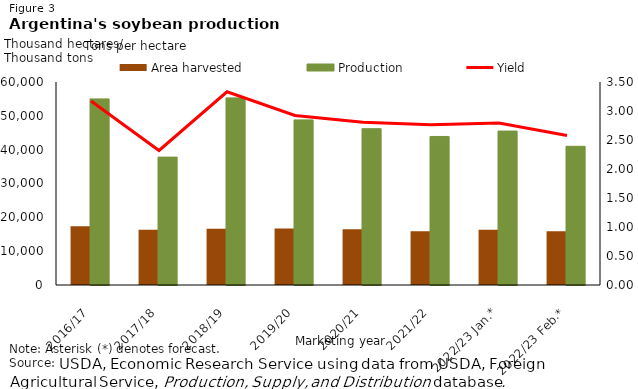
| Category | Area harvested | Production |
|---|---|---|
| 2016/17 | 17335 | 55000 |
| 2017/18 | 16300 | 37800 |
| 2018/19 | 16600 | 55300 |
| 2019/20 | 16700 | 48800 |
| 2020/21 | 16470 | 46200 |
| 2021/22 | 15900 | 43900 |
| 2022/23 Jan.* | 16300 | 45500 |
| 2022/23 Feb.* | 15900 | 41000 |